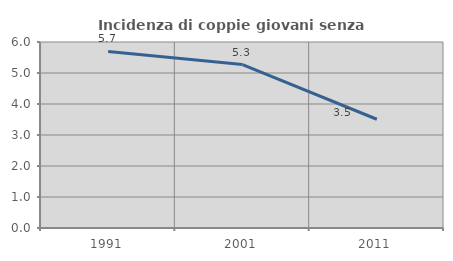
| Category | Incidenza di coppie giovani senza figli |
|---|---|
| 1991.0 | 5.694 |
| 2001.0 | 5.273 |
| 2011.0 | 3.508 |